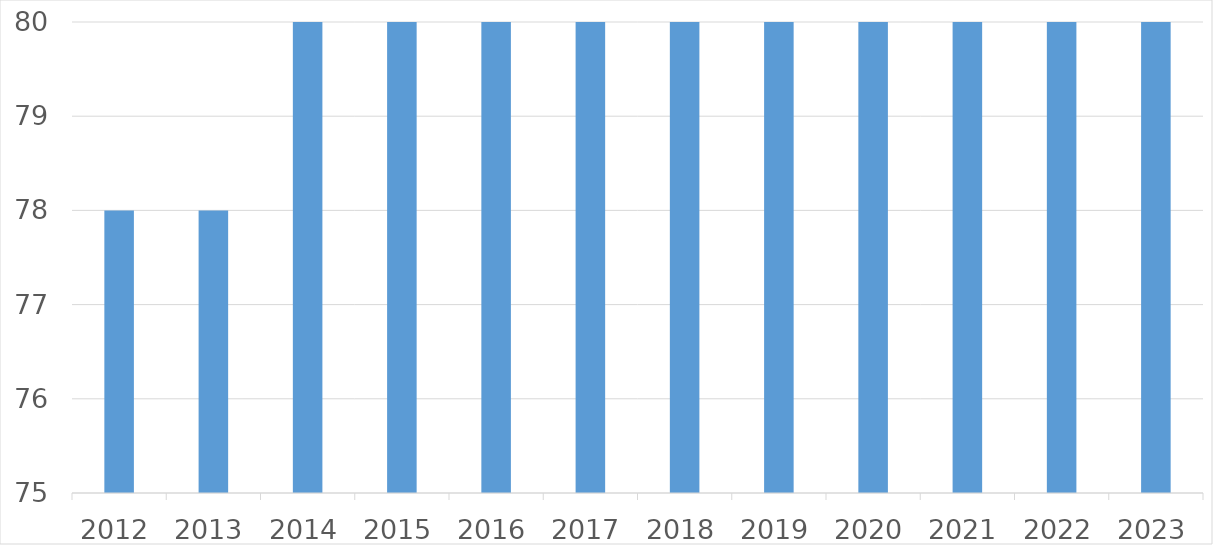
| Category | Series 0 |
|---|---|
| 2012 | 78 |
| 2013 | 78 |
| 2014 | 80 |
| 2015 | 80 |
| 2016 | 80 |
| 2017 | 80 |
| 2018 | 80 |
| 2019 | 80 |
| 2020 | 80 |
| 2021 | 80 |
| 2022 | 80 |
| 2023 | 80 |